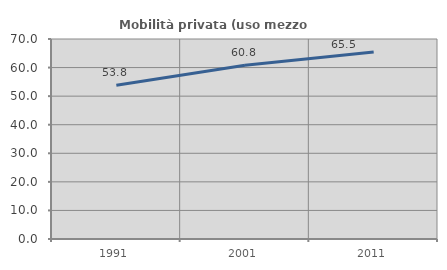
| Category | Mobilità privata (uso mezzo privato) |
|---|---|
| 1991.0 | 53.846 |
| 2001.0 | 60.829 |
| 2011.0 | 65.468 |